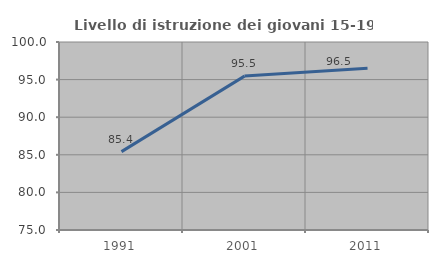
| Category | Livello di istruzione dei giovani 15-19 anni |
|---|---|
| 1991.0 | 85.42 |
| 2001.0 | 95.463 |
| 2011.0 | 96.503 |